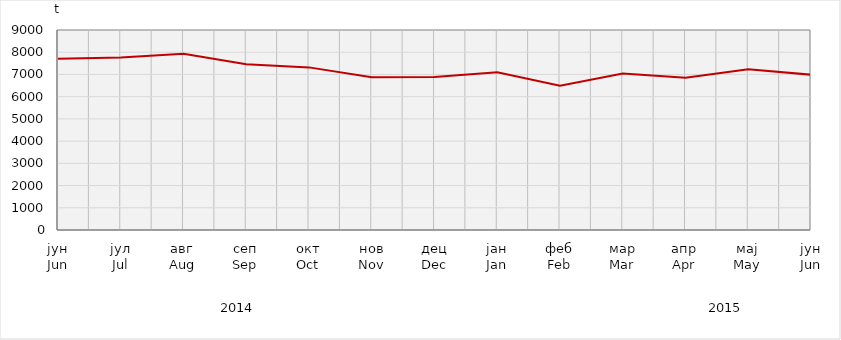
| Category | Series 0 |
|---|---|
| јун
Jun | 7705.273 |
| јул
Jul | 7759.37 |
| авг
Aug | 7925.8 |
| сеп
Sep | 7457.865 |
| окт
Oct | 7318.004 |
| нов
Nov | 6875.135 |
| дец
Dec | 6887.315 |
| јан
Jan | 7099.8 |
| феб
Feb | 6490.829 |
| мар
Mar | 7044.938 |
| апр
Apr | 6847.171 |
| мај
May | 7231.754 |
| јун
Jun | 6987.984 |